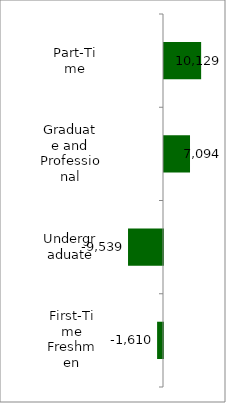
| Category | 50 states and D.C. |
|---|---|
| First-Time Freshmen | -1610 |
| Undergraduate | -9539 |
| Graduate and Professional | 7094 |
| Part-Time | 10129 |